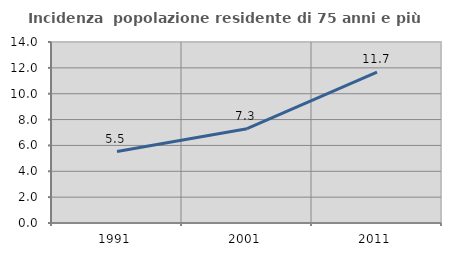
| Category | Incidenza  popolazione residente di 75 anni e più |
|---|---|
| 1991.0 | 5.525 |
| 2001.0 | 7.297 |
| 2011.0 | 11.678 |